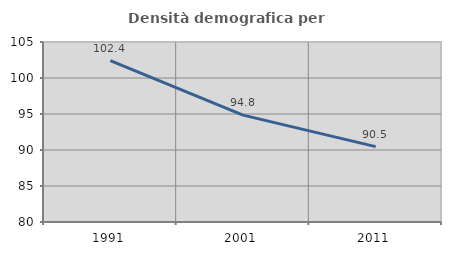
| Category | Densità demografica |
|---|---|
| 1991.0 | 102.415 |
| 2001.0 | 94.849 |
| 2011.0 | 90.464 |